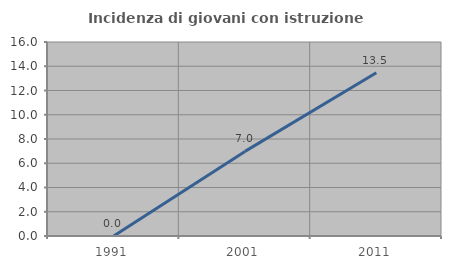
| Category | Incidenza di giovani con istruzione universitaria |
|---|---|
| 1991.0 | 0 |
| 2001.0 | 6.977 |
| 2011.0 | 13.462 |